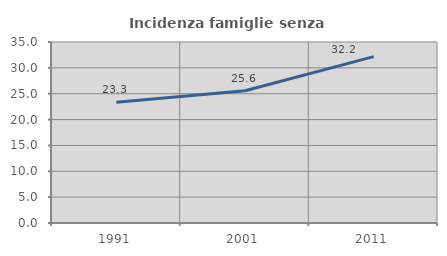
| Category | Incidenza famiglie senza nuclei |
|---|---|
| 1991.0 | 23.344 |
| 2001.0 | 25.581 |
| 2011.0 | 32.176 |